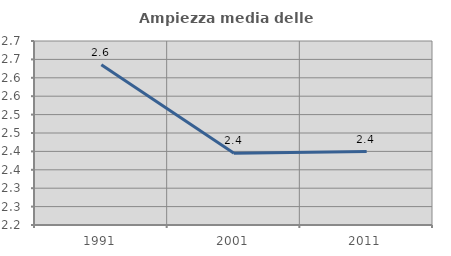
| Category | Ampiezza media delle famiglie |
|---|---|
| 1991.0 | 2.636 |
| 2001.0 | 2.395 |
| 2011.0 | 2.399 |